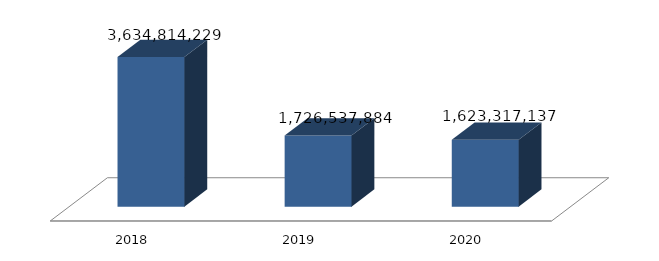
| Category | Dukungan Manajemen dan Pelaksanaan Tugas Teknis Lainnya Intelijen Negara |
|---|---|
| 2018.0 | 3634814229 |
| 2019.0 | 1726537884 |
| 2020.0 | 1623317137 |